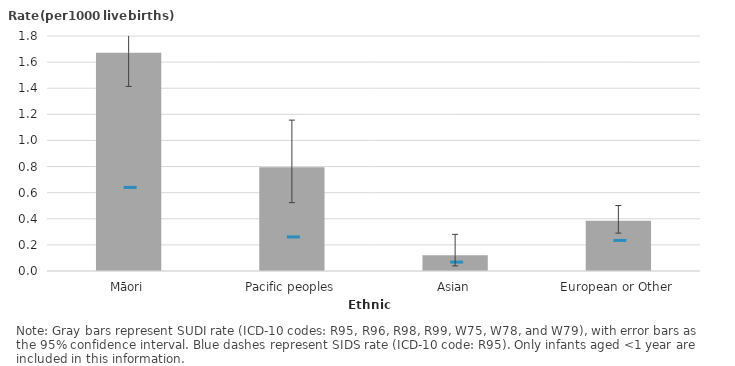
| Category | SUDI |
|---|---|
| Māori | 1.672 |
| Pacific peoples | 0.794 |
| Asian | 0.12 |
| European or Other | 0.385 |